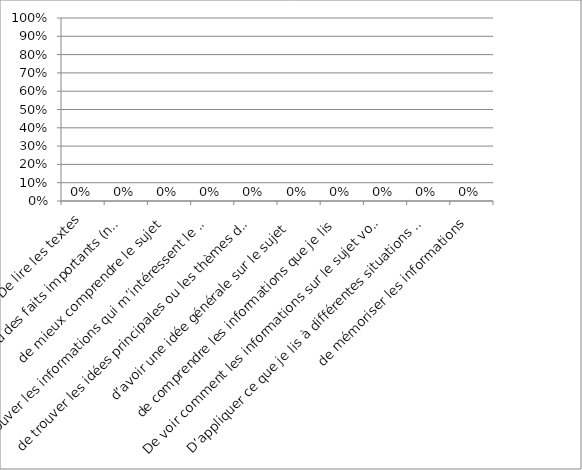
| Category | Series 0 |
|---|---|
| De lire les textes | 0 |
| De trouver des détails ou des faits importants (noms, dates) | 0 |
| de mieux comprendre le sujet | 0 |
| de trouver les informations qui m’intéressent le plus | 0 |
| de trouver les idées principales ou les thèmes des textes à lire  | 0 |
| d’avoir une idée générale sur le sujet  | 0 |
| de comprendre les informations que je lis | 0 |
| De voir comment les informations sur le sujet vont ensemble | 0 |
| D’appliquer ce que je lis à différentes situations ou problèmes | 0 |
| de mémoriser les informations | 0 |